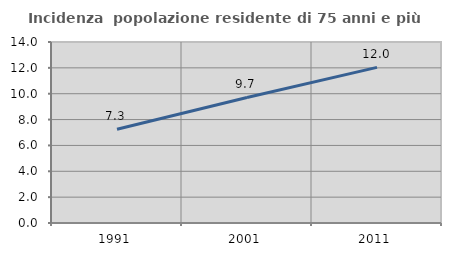
| Category | Incidenza  popolazione residente di 75 anni e più |
|---|---|
| 1991.0 | 7.257 |
| 2001.0 | 9.712 |
| 2011.0 | 12.037 |